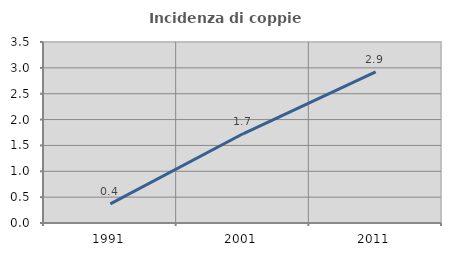
| Category | Incidenza di coppie miste |
|---|---|
| 1991.0 | 0.371 |
| 2001.0 | 1.725 |
| 2011.0 | 2.92 |